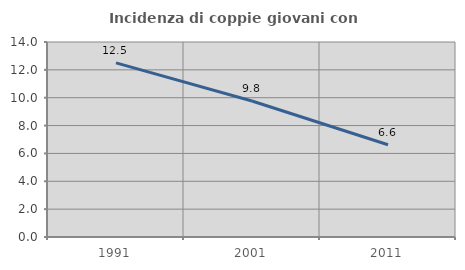
| Category | Incidenza di coppie giovani con figli |
|---|---|
| 1991.0 | 12.502 |
| 2001.0 | 9.761 |
| 2011.0 | 6.624 |